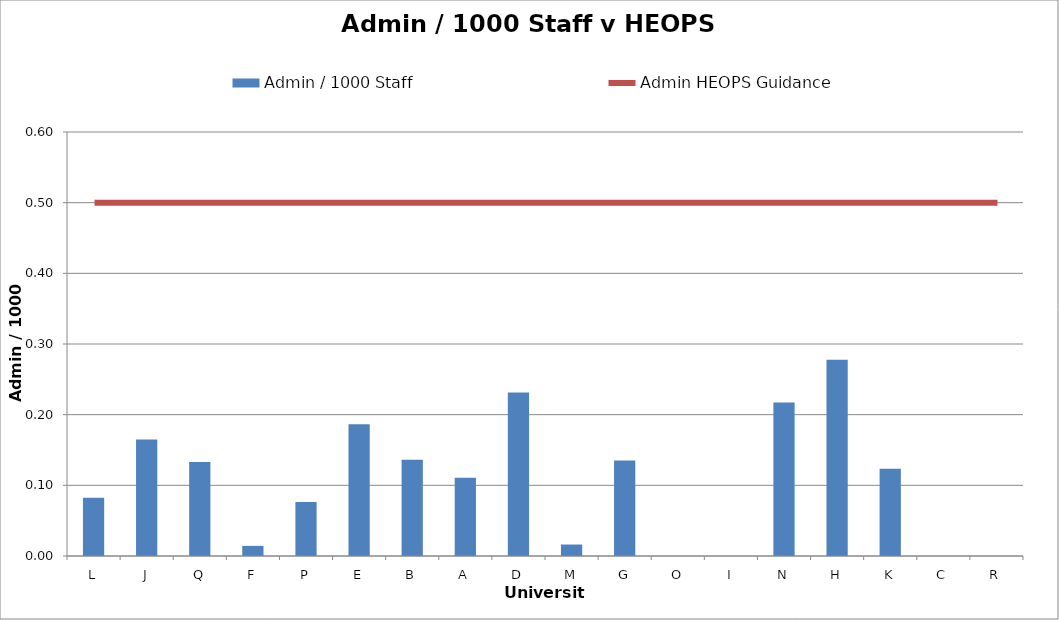
| Category | Admin / 1000 Staff  |
|---|---|
| L | 0.082 |
| J | 0.165 |
| Q | 0.133 |
| F | 0.014 |
| P | 0.076 |
| E | 0.186 |
| B | 0.136 |
| A | 0.111 |
| D | 0.231 |
| M | 0.016 |
| G | 0.135 |
| O | 0 |
| I | 0 |
| N | 0.217 |
| H | 0.278 |
| K | 0.124 |
| C | 0 |
| R | 0 |